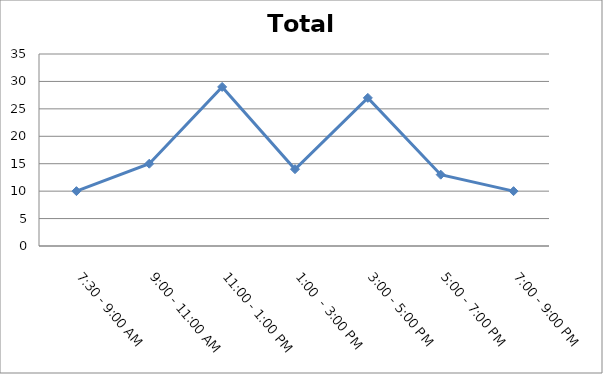
| Category | Total |
|---|---|
| 7:30 - 9:00 AM | 10 |
| 9:00 - 11:00 AM | 15 |
| 11:00 - 1:00 PM | 29 |
| 1:00  - 3:00 PM | 14 |
| 3:00 - 5:00 PM | 27 |
| 5:00 - 7:00 PM | 13 |
| 7:00 - 9:00 PM | 10 |